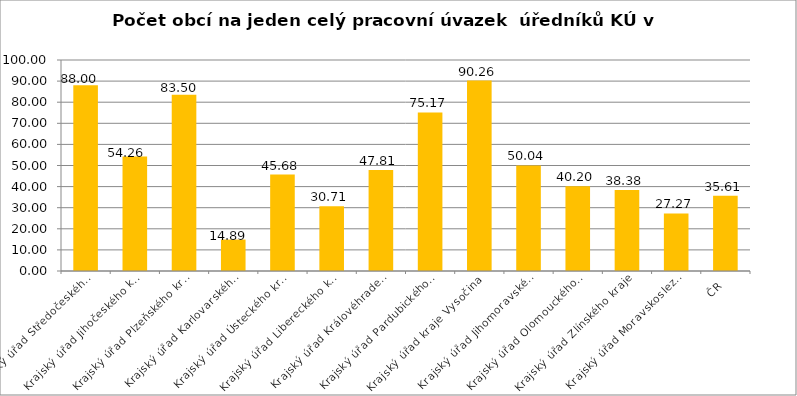
| Category | Počet obcí na jeden celý pracovní úvazek  úředníků KÚ |
|---|---|
| Krajský úřad Středočeského kraje | 88 |
| Krajský úřad Jihočeského kraje | 54.26 |
| Krajský úřad Plzeňského kraje | 83.5 |
| Krajský úřad Karlovarského kraje | 14.89 |
| Krajský úřad Ústeckého kraje | 45.68 |
| Krajský úřad Libereckého kraje | 30.71 |
| Krajský úřad Královéhradeckého kraje | 47.81 |
| Krajský úřad Pardubického kraje | 75.17 |
| Krajský úřad kraje Vysočina | 90.26 |
| Krajský úřad Jihomoravského kraje | 50.04 |
| Krajský úřad Olomouckého kraje | 40.2 |
| Krajský úřad Zlínského kraje | 38.38 |
| Krajský úřad Moravskoslezského kraje | 27.27 |
| ČR | 35.61 |